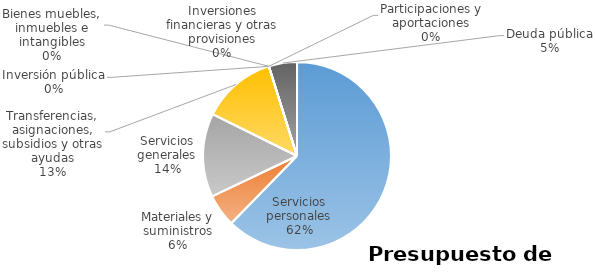
| Category | Series 0 | Series 1 | Series 2 | Series 3 | Series 4 | Series 5 |
|---|---|---|---|---|---|---|
| Servicios personales | 24320145 |  |  |  |  |  |
| Materiales y suministros | 2188500 |  |  |  |  |  |
| Servicios generales | 5625500 |  |  |  |  |  |
| Transferencias, asignaciones, subsidios y otras ayudas | 5007450 |  |  |  |  |  |
| Bienes muebles, inmuebles e intangibles | 0 |  |  |  |  |  |
| Inversión pública | 0 |  |  |  |  |  |
| Inversiones financieras y otras provisiones | 0 |  |  |  |  |  |
| Participaciones y aportaciones | 0 |  |  |  |  |  |
| Deuda pública | 1890000 |  |  |  |  |  |